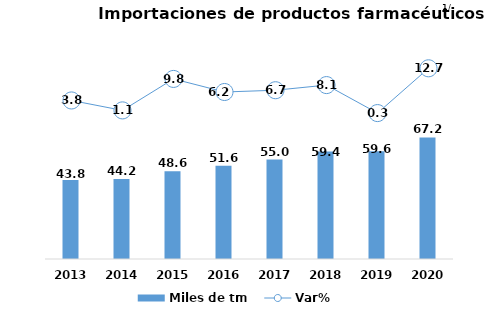
| Category | Miles de tm |
|---|---|
| 2013.0 | 43.754 |
| 2014.0 | 44.23 |
| 2015.0 | 48.56 |
| 2016.0 | 51.558 |
| 2017.0 | 54.995 |
| 2018.0 | 59.443 |
| 2019.0 | 59.649 |
| 2020.0 | 67.241 |